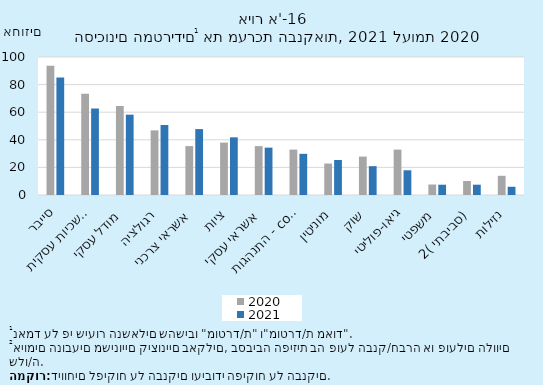
| Category | 2020 | 2021 |
|---|---|---|
| סייבר | 93.671 | 85.075 |
| טכנולוגי והמשכיות עסקית | 73.418 | 62.687 |
| מודל עסקי | 64.557 | 58.209 |
| רגולציה | 46.835 | 50.746 |
| אשראי צרכני | 35.443 | 47.761 |
| ציות | 37.975 | 41.791 |
| אשראי עסקי | 35.443 | 34.328 |
| התנהגות - conduct | 32.911 | 29.851 |
| מוניטין | 22.785 | 25.373 |
| שוק | 27.848 | 20.896 |
| גיאו-פוליטי | 32.911 | 17.91 |
| משפטי | 7.595 | 7.463 |
| סביבתי (2) | 10.127 | 7.463 |
| נזילות | 13.924 | 5.97 |